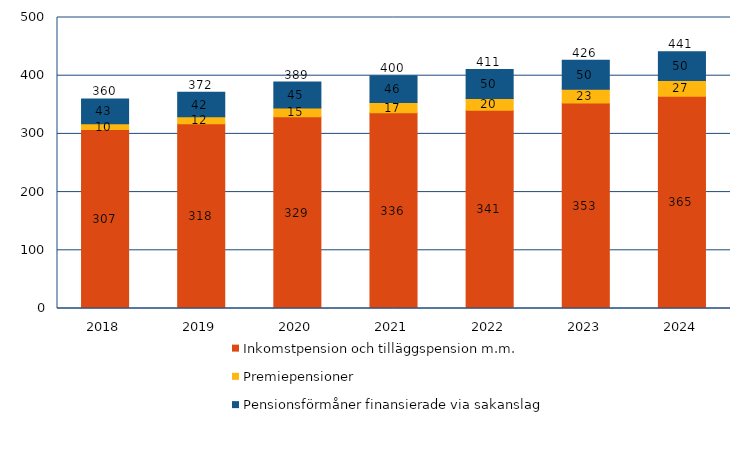
| Category | Inkomstpension och tilläggspension m.m. | Premiepensioner | Pensionsförmåner finansierade via sakanslag | Series 3 |
|---|---|---|---|---|
| 2018.0 | 307.356 | 10.141 | 42.55 | 360.046 |
| 2019.0 | 317.628 | 11.715 | 42.22 | 371.563 |
| 2020.0 | 329.386 | 15.067 | 44.526 | 388.979 |
| 2021.0 | 336.441 | 17.3 | 45.966 | 399.707 |
| 2022.0 | 340.826 | 20.208 | 49.676 | 410.71 |
| 2023.0 | 353.183 | 23.378 | 49.899 | 426.46 |
| 2024.0 | 364.75 | 26.834 | 49.643 | 441.227 |